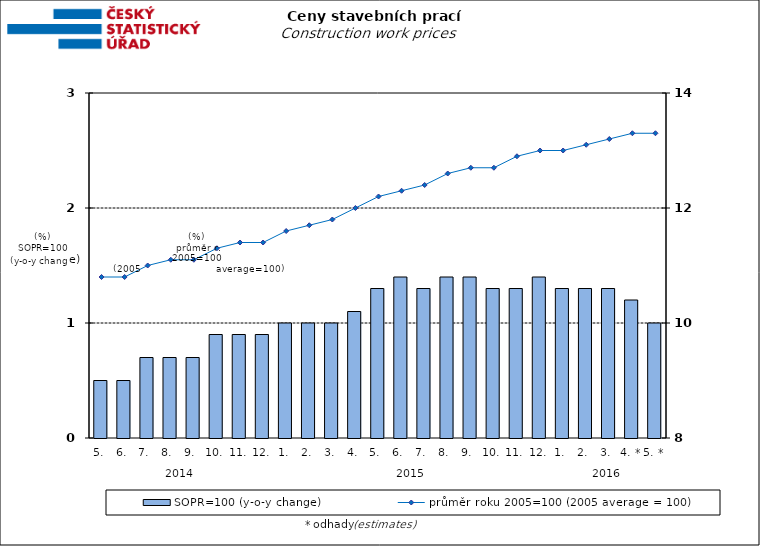
| Category | SOPR=100 (y-o-y change)   |
|---|---|
| 0 | 0.5 |
| 1 | 0.5 |
| 2 | 0.7 |
| 3 | 0.7 |
| 4 | 0.7 |
| 5 | 0.9 |
| 6 | 0.9 |
| 7 | 0.9 |
| 8 | 1 |
| 9 | 1 |
| 10 | 1 |
| 11 | 1.1 |
| 12 | 1.3 |
| 13 | 1.4 |
| 14 | 1.3 |
| 15 | 1.4 |
| 16 | 1.4 |
| 17 | 1.3 |
| 18 | 1.3 |
| 19 | 1.4 |
| 20 | 1.3 |
| 21 | 1.3 |
| 22 | 1.3 |
| 23 | 1.2 |
| 24 | 1 |